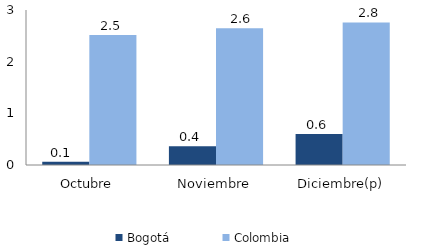
| Category | Bogotá | Colombia |
|---|---|---|
| Octubre | 0.061 | 2.517 |
| Noviembre | 0.364 | 2.648 |
| Diciembre(p) | 0.6 | 2.758 |